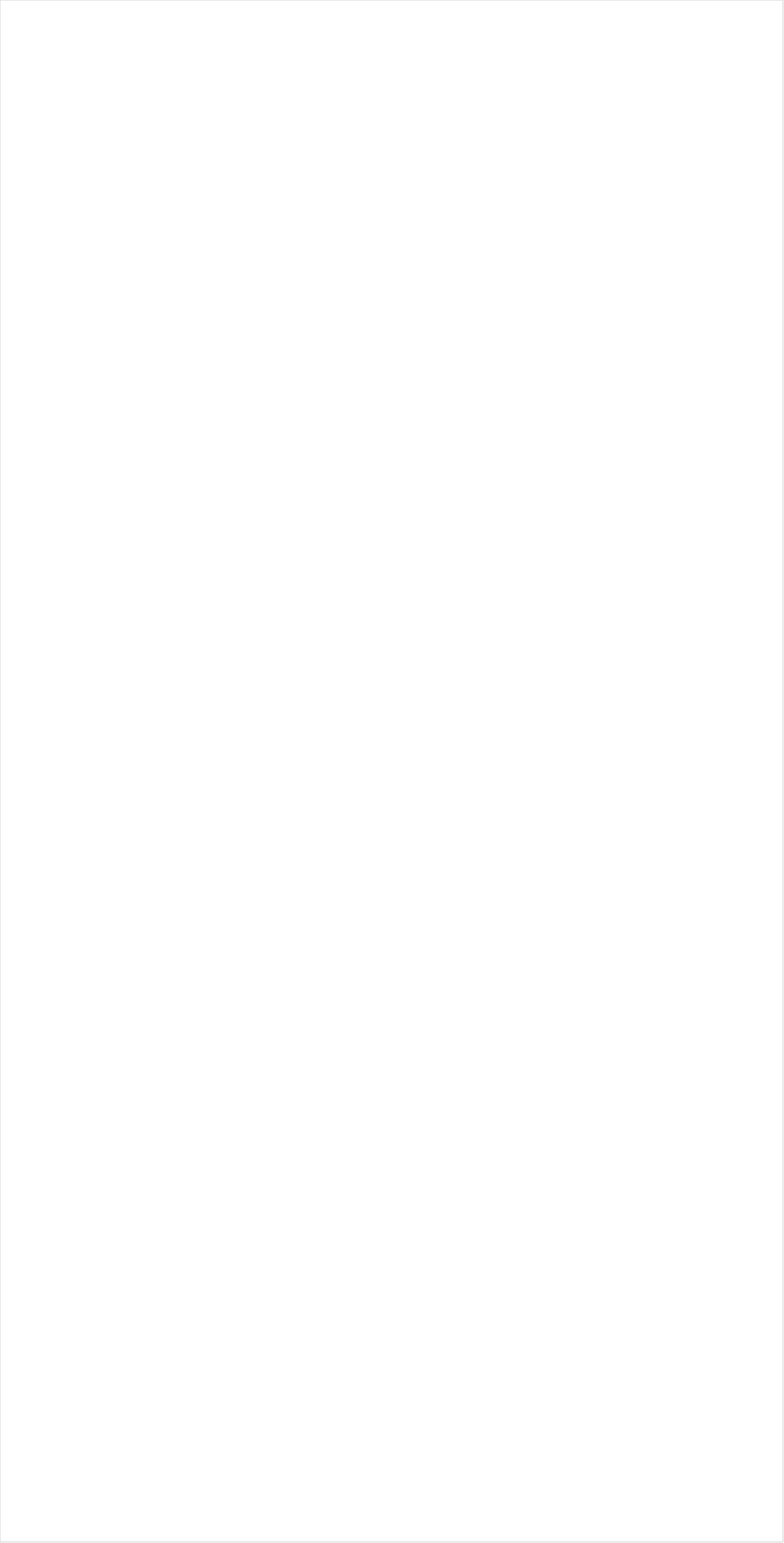
| Category | Total |
|---|---|
| TUDN | -0.935 |
| Telemundo | -0.931 |
| Galavision | -0.927 |
| UniMas | -0.913 |
| Univision | -0.907 |
| NBC Universo | -0.826 |
| BET | -0.715 |
| MTV2 | -0.653 |
| BET Her | -0.652 |
| NBA TV | -0.632 |
| TV ONE | -0.605 |
| VH1 | -0.546 |
| Disney Channel | -0.415 |
| Nick Toons | -0.411 |
| Nick | -0.391 |
| MSNBC | -0.389 |
| Nick Jr. | -0.368 |
| Oprah Winfrey Network | -0.349 |
| Lifetime Movies | -0.337 |
| Disney XD | -0.334 |
| Adult Swim | -0.333 |
| Nick@Nite | -0.328 |
| CNN | -0.312 |
| TLC | -0.283 |
| Teen Nick | -0.271 |
| Disney Junior US | -0.263 |
| WE TV | -0.261 |
| PBS | -0.259 |
| Universal Kids | -0.247 |
| Lifetime | -0.235 |
| ESPN Deportes | -0.18 |
| BRAVO | -0.174 |
| FX | -0.165 |
| E! | -0.163 |
| MyNetworkTV | -0.16 |
| Discovery Life Channel | -0.131 |
| MTV | -0.116 |
| Comedy Central | -0.115 |
| Viceland | -0.093 |
| Discovery Family Channel | -0.091 |
| Tennis Channel | -0.088 |
| FXX | -0.033 |
| Hallmark Movies & Mysteries | -0.017 |
| Freeform | -0.015 |
| HGTV | -0.015 |
| ION | -0.012 |
| Investigation Discovery | -0.009 |
| CW | -0.002 |
| Hallmark | -0.002 |
| Headline News | 0.008 |
| UP TV | 0.025 |
| FX Movie Channel | 0.035 |
| SYFY | 0.046 |
| TNT | 0.055 |
| truTV | 0.069 |
| TBS | 0.071 |
| OXYGEN | 0.072 |
| Logo | 0.073 |
| USA Network | 0.077 |
| ABC | 0.102 |
| Bloomberg HD | 0.107 |
| Golf | 0.114 |
| Game Show | 0.13 |
| ESPN2 | 0.143 |
| SundanceTV | 0.15 |
| CNBC | 0.159 |
| National Geographic Wild | 0.163 |
| Travel | 0.176 |
| Food Network | 0.184 |
| Reelz Channel | 0.201 |
| Paramount Network | 0.214 |
| AMC | 0.219 |
| Ovation | 0.25 |
| NFL Network | 0.264 |
| Big Ten Network | 0.267 |
| Olympic Channel | 0.299 |
| BBC America | 0.314 |
| POP | 0.33 |
| Cooking Channel | 0.335 |
| ESPN | 0.354 |
| Fox Business | 0.379 |
| CBS | 0.39 |
| Independent Film (IFC) | 0.396 |
| WGN America | 0.397 |
| CMTV | 0.406 |
| NBC | 0.406 |
| A&E | 0.438 |
| TV LAND | 0.446 |
| NHL | 0.449 |
| Fox News | 0.449 |
| National Geographic | 0.457 |
| MLB Network | 0.465 |
| American Heroes Channel | 0.489 |
| PAC-12 Network | 0.504 |
| Great American Country | 0.511 |
| ESPNU | 0.533 |
| DIY | 0.541 |
| ESPNEWS | 0.556 |
| INSP | 0.577 |
| Destination America | 0.682 |
| Animal Planet | 0.714 |
| Smithsonian | 0.72 |
| Science Channel | 0.757 |
| FOX | 0.805 |
| History Channel | 0.835 |
| Weather Channel | 0.845 |
| FYI | 0.947 |
| Discovery Channel | 0.987 |
| The Sportsman Channel | 1.169 |
| Outdoor Channel | 1.226 |
| RFD TV | 1.555 |
| CBS Sports | 1.583 |
| NBC Sports | 1.642 |
| Motor Trend Network | 1.701 |
| FOX Sports 2 | 4.001 |
| Fox Sports 1 | 6.643 |
| FXDEP | 7.055 |